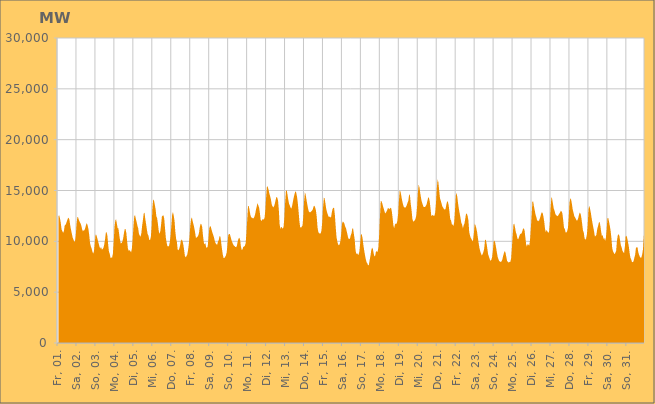
| Category | Series 0 |
|---|---|
|  Fr, 01.  | 12470.045 |
|  Fr, 01.  | 12579.284 |
|  Fr, 01.  | 12264.024 |
|  Fr, 01.  | 11831.025 |
|  Fr, 01.  | 11190.778 |
|  Fr, 01.  | 10995.93 |
|  Fr, 01.  | 10841.013 |
|  Fr, 01.  | 11021.117 |
|  Fr, 01.  | 11565.128 |
|  Fr, 01.  | 11624.901 |
|  Fr, 01.  | 11789.44 |
|  Fr, 01.  | 12039.204 |
|  Fr, 01.  | 12247.972 |
|  Fr, 01.  | 12329.81 |
|  Fr, 01.  | 12092.422 |
|  Fr, 01.  | 11547.91 |
|  Fr, 01.  | 11128.463 |
|  Sa, 02.  | 10759.874 |
|  Sa, 02.  | 10378.905 |
|  Sa, 02.  | 10196.635 |
|  Sa, 02.  | 9977.144 |
|  Sa, 02.  | 9987.617 |
|  Sa, 02.  | 10588.651 |
|  Sa, 02.  | 11725.365 |
|  Sa, 02.  | 12389.724 |
|  Sa, 02.  | 12343.848 |
|  Sa, 02.  | 12091.464 |
|  Sa, 02.  | 11911.762 |
|  Sa, 02.  | 11768.814 |
|  Sa, 02.  | 11549.215 |
|  Sa, 02.  | 11196.974 |
|  Sa, 02.  | 10992.181 |
|  Sa, 02.  | 11084.473 |
|  Sa, 02.  | 11095.089 |
|  Sa, 02.  | 11310.61 |
|  Sa, 02.  | 11616.985 |
|  Sa, 02.  | 11796.725 |
|  Sa, 02.  | 11566.871 |
|  Sa, 02.  | 11211.464 |
|  Sa, 02.  | 10649.488 |
|  Sa, 02.  | 9843.555 |
|  So, 03.  | 9511.741 |
|  So, 03.  | 9309.536 |
|  So, 03.  | 9007.532 |
|  So, 03.  | 8792.565 |
|  So, 03.  | 9015.24 |
|  So, 03.  | 9802.419 |
|  So, 03.  | 10660.798 |
|  So, 03.  | 10641.216 |
|  So, 03.  | 10369.956 |
|  So, 03.  | 10086.164 |
|  So, 03.  | 9777.794 |
|  So, 03.  | 9479.992 |
|  So, 03.  | 9280.482 |
|  So, 03.  | 9453.215 |
|  So, 03.  | 9188.988 |
|  So, 03.  | 9235.819 |
|  So, 03.  | 9350.889 |
|  So, 03.  | 9688.885 |
|  So, 03.  | 10147.957 |
|  So, 03.  | 10824.316 |
|  So, 03.  | 10922.26 |
|  So, 03.  | 10545.41 |
|  So, 03.  | 9702.404 |
|  So, 03.  | 8962.431 |
|  Mo, 04.  | 8784.504 |
|  Mo, 04.  | 8354.536 |
|  Mo, 04.  | 8411.387 |
|  Mo, 04.  | 8404.765 |
|  Mo, 04.  | 8795.974 |
|  Mo, 04.  | 9951.689 |
|  Mo, 04.  | 11378.006 |
|  Mo, 04.  | 12028.84 |
|  Mo, 04.  | 12188.491 |
|  Mo, 04.  | 11734.409 |
|  Mo, 04.  | 11306.727 |
|  Mo, 04.  | 11262.249 |
|  Mo, 04.  | 10655.644 |
|  Mo, 04.  | 10128.674 |
|  Mo, 04.  | 9785.554 |
|  Mo, 04.  | 9840.763 |
|  Mo, 04.  | 9981.282 |
|  Mo, 04.  | 10306.964 |
|  Mo, 04.  | 10799.12 |
|  Mo, 04.  | 11201.983 |
|  Mo, 04.  | 11211.534 |
|  Mo, 04.  | 10828.387 |
|  Mo, 04.  | 10006.678 |
|  Mo, 04.  | 9292.177 |
|  Di, 05.  | 9070.221 |
|  Di, 05.  | 9130.839 |
|  Di, 05.  | 9047.178 |
|  Di, 05.  | 8911.95 |
|  Di, 05.  | 9291.472 |
|  Di, 05.  | 10222.007 |
|  Di, 05.  | 11434.899 |
|  Di, 05.  | 12460.883 |
|  Di, 05.  | 12587.895 |
|  Di, 05.  | 12233.071 |
|  Di, 05.  | 11904.814 |
|  Di, 05.  | 11548.537 |
|  Di, 05.  | 11281.24 |
|  Di, 05.  | 10732.146 |
|  Di, 05.  | 10568.035 |
|  Di, 05.  | 10446.677 |
|  Di, 05.  | 10801.356 |
|  Di, 05.  | 11536.17 |
|  Di, 05.  | 12098.566 |
|  Di, 05.  | 12746.347 |
|  Di, 05.  | 12825.971 |
|  Di, 05.  | 12196.645 |
|  Di, 05.  | 11708.184 |
|  Di, 05.  | 11167.269 |
|  Mi, 06.  | 10699.596 |
|  Mi, 06.  | 10561.771 |
|  Mi, 06.  | 10154.91 |
|  Mi, 06.  | 10125.99 |
|  Mi, 06.  | 10414.044 |
|  Mi, 06.  | 11431.736 |
|  Mi, 06.  | 13247.887 |
|  Mi, 06.  | 14133.794 |
|  Mi, 06.  | 14007.125 |
|  Mi, 06.  | 13610.049 |
|  Mi, 06.  | 13174.088 |
|  Mi, 06.  | 12470.583 |
|  Mi, 06.  | 12272.704 |
|  Mi, 06.  | 11710.298 |
|  Mi, 06.  | 11014.485 |
|  Mi, 06.  | 10741.12 |
|  Mi, 06.  | 10993.189 |
|  Mi, 06.  | 11648.631 |
|  Mi, 06.  | 12424.979 |
|  Mi, 06.  | 12535.889 |
|  Mi, 06.  | 12563.196 |
|  Mi, 06.  | 12207.325 |
|  Mi, 06.  | 11255.182 |
|  Mi, 06.  | 10356.174 |
|  Do, 07.  | 9881.779 |
|  Do, 07.  | 9523.425 |
|  Do, 07.  | 9509.322 |
|  Do, 07.  | 9523.329 |
|  Do, 07.  | 9923.382 |
|  Do, 07.  | 10567.877 |
|  Do, 07.  | 11567.861 |
|  Do, 07.  | 12609.888 |
|  Do, 07.  | 12896.24 |
|  Do, 07.  | 12519.616 |
|  Do, 07.  | 12027.759 |
|  Do, 07.  | 10958.798 |
|  Do, 07.  | 10260.236 |
|  Do, 07.  | 9932.591 |
|  Do, 07.  | 9171.962 |
|  Do, 07.  | 9127.922 |
|  Do, 07.  | 9290.294 |
|  Do, 07.  | 9569.246 |
|  Do, 07.  | 10043.785 |
|  Do, 07.  | 10183.195 |
|  Do, 07.  | 10058.85 |
|  Do, 07.  | 9733.159 |
|  Do, 07.  | 9230.453 |
|  Do, 07.  | 8606.601 |
|  Fr, 08.  | 8425.27 |
|  Fr, 08.  | 8523.573 |
|  Fr, 08.  | 8673.962 |
|  Fr, 08.  | 9065.229 |
|  Fr, 08.  | 9663.098 |
|  Fr, 08.  | 10471.212 |
|  Fr, 08.  | 11567.649 |
|  Fr, 08.  | 12182.165 |
|  Fr, 08.  | 12345.604 |
|  Fr, 08.  | 11970.049 |
|  Fr, 08.  | 11672.742 |
|  Fr, 08.  | 11320.872 |
|  Fr, 08.  | 10881.437 |
|  Fr, 08.  | 10373.778 |
|  Fr, 08.  | 10360.007 |
|  Fr, 08.  | 10451.458 |
|  Fr, 08.  | 10559.697 |
|  Fr, 08.  | 10849.24 |
|  Fr, 08.  | 11417.743 |
|  Fr, 08.  | 11727.408 |
|  Fr, 08.  | 11680.441 |
|  Fr, 08.  | 11410.719 |
|  Fr, 08.  | 10585.961 |
|  Fr, 08.  | 9919.559 |
|  Sa, 09.  | 9692.706 |
|  Sa, 09.  | 9822.974 |
|  Sa, 09.  | 9436.05 |
|  Sa, 09.  | 9348.416 |
|  Sa, 09.  | 9495.277 |
|  Sa, 09.  | 10314.714 |
|  Sa, 09.  | 11291.765 |
|  Sa, 09.  | 11523.163 |
|  Sa, 09.  | 11402.611 |
|  Sa, 09.  | 11104.646 |
|  Sa, 09.  | 10837.048 |
|  Sa, 09.  | 10622.243 |
|  Sa, 09.  | 10363.615 |
|  Sa, 09.  | 10023.064 |
|  Sa, 09.  | 9806.507 |
|  Sa, 09.  | 9710.982 |
|  Sa, 09.  | 9671.656 |
|  Sa, 09.  | 9986.29 |
|  Sa, 09.  | 10133.873 |
|  Sa, 09.  | 10527.428 |
|  Sa, 09.  | 10469.307 |
|  Sa, 09.  | 9906.316 |
|  Sa, 09.  | 9286.69 |
|  Sa, 09.  | 8736.228 |
|  So, 10.  | 8373.814 |
|  So, 10.  | 8359.905 |
|  So, 10.  | 8464.729 |
|  So, 10.  | 8605.559 |
|  So, 10.  | 8901.723 |
|  So, 10.  | 9638.665 |
|  So, 10.  | 10611.814 |
|  So, 10.  | 10732.565 |
|  So, 10.  | 10718.493 |
|  So, 10.  | 10432.608 |
|  So, 10.  | 10147.333 |
|  So, 10.  | 9913.026 |
|  So, 10.  | 9739.812 |
|  So, 10.  | 9588.663 |
|  So, 10.  | 9536.704 |
|  So, 10.  | 9436.427 |
|  So, 10.  | 9428.472 |
|  So, 10.  | 9589.456 |
|  So, 10.  | 9993.66 |
|  So, 10.  | 10272.355 |
|  So, 10.  | 10358.533 |
|  So, 10.  | 10159.177 |
|  So, 10.  | 9494.374 |
|  So, 10.  | 9153.733 |
|  Mo, 11.  | 9188.825 |
|  Mo, 11.  | 9456.394 |
|  Mo, 11.  | 9475.973 |
|  Mo, 11.  | 9549.127 |
|  Mo, 11.  | 9821.698 |
|  Mo, 11.  | 10779.585 |
|  Mo, 11.  | 12080.499 |
|  Mo, 11.  | 13455.255 |
|  Mo, 11.  | 13482.77 |
|  Mo, 11.  | 13025.238 |
|  Mo, 11.  | 12593.2 |
|  Mo, 11.  | 12357.89 |
|  Mo, 11.  | 12332.527 |
|  Mo, 11.  | 12263.578 |
|  Mo, 11.  | 12263.409 |
|  Mo, 11.  | 12392.698 |
|  Mo, 11.  | 12659.495 |
|  Mo, 11.  | 13071.538 |
|  Mo, 11.  | 13415.481 |
|  Mo, 11.  | 13770.832 |
|  Mo, 11.  | 13539.051 |
|  Mo, 11.  | 13340.712 |
|  Mo, 11.  | 12807.211 |
|  Mo, 11.  | 12132.086 |
|  Di, 12.  | 11999.17 |
|  Di, 12.  | 12152.092 |
|  Di, 12.  | 12178.994 |
|  Di, 12.  | 12140.769 |
|  Di, 12.  | 12332.086 |
|  Di, 12.  | 13117.255 |
|  Di, 12.  | 14405.647 |
|  Di, 12.  | 15440.513 |
|  Di, 12.  | 15358.984 |
|  Di, 12.  | 15091.4 |
|  Di, 12.  | 14714.685 |
|  Di, 12.  | 14432.677 |
|  Di, 12.  | 14133.221 |
|  Di, 12.  | 13643.782 |
|  Di, 12.  | 13444.063 |
|  Di, 12.  | 13340.153 |
|  Di, 12.  | 13459.05 |
|  Di, 12.  | 13722.418 |
|  Di, 12.  | 14071.435 |
|  Di, 12.  | 14375.322 |
|  Di, 12.  | 14305.829 |
|  Di, 12.  | 14026.325 |
|  Di, 12.  | 13124.068 |
|  Di, 12.  | 11695.294 |
|  Mi, 13.  | 11207.292 |
|  Mi, 13.  | 11436.828 |
|  Mi, 13.  | 11341.08 |
|  Mi, 13.  | 11232.356 |
|  Mi, 13.  | 11415.734 |
|  Mi, 13.  | 12284.977 |
|  Mi, 13.  | 13801.102 |
|  Mi, 13.  | 14945.613 |
|  Mi, 13.  | 15035.051 |
|  Mi, 13.  | 14592.859 |
|  Mi, 13.  | 14072.063 |
|  Mi, 13.  | 13690.605 |
|  Mi, 13.  | 13505.175 |
|  Mi, 13.  | 13291.454 |
|  Mi, 13.  | 13222.578 |
|  Mi, 13.  | 13542.256 |
|  Mi, 13.  | 13985.048 |
|  Mi, 13.  | 14360.848 |
|  Mi, 13.  | 14683.293 |
|  Mi, 13.  | 14931.568 |
|  Mi, 13.  | 14788.487 |
|  Mi, 13.  | 14419.473 |
|  Mi, 13.  | 13802.077 |
|  Mi, 13.  | 12957.466 |
|  Do, 14.  | 12019.518 |
|  Do, 14.  | 11398.368 |
|  Do, 14.  | 11345.433 |
|  Do, 14.  | 11437.23 |
|  Do, 14.  | 11559.348 |
|  Do, 14.  | 12463.496 |
|  Do, 14.  | 13923.431 |
|  Do, 14.  | 14813.142 |
|  Do, 14.  | 14585.404 |
|  Do, 14.  | 14120.61 |
|  Do, 14.  | 13653.94 |
|  Do, 14.  | 13230.466 |
|  Do, 14.  | 12932.462 |
|  Do, 14.  | 12867.554 |
|  Do, 14.  | 12867.138 |
|  Do, 14.  | 12933.639 |
|  Do, 14.  | 13024.907 |
|  Do, 14.  | 13142.434 |
|  Do, 14.  | 13434.499 |
|  Do, 14.  | 13500.351 |
|  Do, 14.  | 13332.348 |
|  Do, 14.  | 13024.942 |
|  Do, 14.  | 12411.388 |
|  Do, 14.  | 11355.239 |
|  Fr, 15.  | 10934.244 |
|  Fr, 15.  | 10774.744 |
|  Fr, 15.  | 10788.732 |
|  Fr, 15.  | 10772.951 |
|  Fr, 15.  | 11084.754 |
|  Fr, 15.  | 11924.153 |
|  Fr, 15.  | 13340.119 |
|  Fr, 15.  | 14282.343 |
|  Fr, 15.  | 14227.926 |
|  Fr, 15.  | 13730.312 |
|  Fr, 15.  | 13184.681 |
|  Fr, 15.  | 12876.907 |
|  Fr, 15.  | 12646.066 |
|  Fr, 15.  | 12422.493 |
|  Fr, 15.  | 12407.947 |
|  Fr, 15.  | 12429.884 |
|  Fr, 15.  | 12313.456 |
|  Fr, 15.  | 12803.142 |
|  Fr, 15.  | 13176.054 |
|  Fr, 15.  | 13316.482 |
|  Fr, 15.  | 13269.851 |
|  Fr, 15.  | 12553.725 |
|  Fr, 15.  | 11425.176 |
|  Fr, 15.  | 10431.643 |
|  Sa, 16.  | 9996.127 |
|  Sa, 16.  | 9711.235 |
|  Sa, 16.  | 9601.175 |
|  Sa, 16.  | 9728.612 |
|  Sa, 16.  | 10045.436 |
|  Sa, 16.  | 10759.018 |
|  Sa, 16.  | 11710.286 |
|  Sa, 16.  | 11945.569 |
|  Sa, 16.  | 11872.616 |
|  Sa, 16.  | 11740.283 |
|  Sa, 16.  | 11455.728 |
|  Sa, 16.  | 11302.512 |
|  Sa, 16.  | 10967.044 |
|  Sa, 16.  | 10624.759 |
|  Sa, 16.  | 10276.561 |
|  Sa, 16.  | 10259.944 |
|  Sa, 16.  | 10239.951 |
|  Sa, 16.  | 10590.081 |
|  Sa, 16.  | 10775.194 |
|  Sa, 16.  | 11249.677 |
|  Sa, 16.  | 11276.132 |
|  Sa, 16.  | 10721.697 |
|  Sa, 16.  | 10209.417 |
|  Sa, 16.  | 9189.638 |
|  So, 17.  | 8747.816 |
|  So, 17.  | 8847.835 |
|  So, 17.  | 8716.929 |
|  So, 17.  | 8681.62 |
|  So, 17.  | 9008.572 |
|  So, 17.  | 9806.432 |
|  So, 17.  | 10721.604 |
|  So, 17.  | 10665.078 |
|  So, 17.  | 10324.74 |
|  So, 17.  | 9655.381 |
|  So, 17.  | 9148.337 |
|  So, 17.  | 8674.712 |
|  So, 17.  | 8266.955 |
|  So, 17.  | 7951.864 |
|  So, 17.  | 7838.754 |
|  So, 17.  | 7633.868 |
|  So, 17.  | 7690.695 |
|  So, 17.  | 8161.176 |
|  So, 17.  | 8576.22 |
|  So, 17.  | 9109.481 |
|  So, 17.  | 9369.429 |
|  So, 17.  | 9276.975 |
|  So, 17.  | 8835.402 |
|  So, 17.  | 8521.634 |
|  Mo, 18.  | 8580.722 |
|  Mo, 18.  | 9007.628 |
|  Mo, 18.  | 9019.429 |
|  Mo, 18.  | 8947.289 |
|  Mo, 18.  | 9391.758 |
|  Mo, 18.  | 10643.276 |
|  Mo, 18.  | 12381.191 |
|  Mo, 18.  | 13972.287 |
|  Mo, 18.  | 13944.681 |
|  Mo, 18.  | 13713.035 |
|  Mo, 18.  | 13404.279 |
|  Mo, 18.  | 13172.322 |
|  Mo, 18.  | 12881.142 |
|  Mo, 18.  | 12737.626 |
|  Mo, 18.  | 12882.915 |
|  Mo, 18.  | 13042.834 |
|  Mo, 18.  | 13249.617 |
|  Mo, 18.  | 13264.128 |
|  Mo, 18.  | 13155.265 |
|  Mo, 18.  | 13267.503 |
|  Mo, 18.  | 13304.441 |
|  Mo, 18.  | 12971.49 |
|  Mo, 18.  | 12322.563 |
|  Mo, 18.  | 11579.113 |
|  Di, 19.  | 11289.348 |
|  Di, 19.  | 11675.015 |
|  Di, 19.  | 11746.467 |
|  Di, 19.  | 11726.46 |
|  Di, 19.  | 11980.071 |
|  Di, 19.  | 12658.078 |
|  Di, 19.  | 13951.892 |
|  Di, 19.  | 15002.134 |
|  Di, 19.  | 14887.831 |
|  Di, 19.  | 14500.069 |
|  Di, 19.  | 14046.886 |
|  Di, 19.  | 13692.885 |
|  Di, 19.  | 13423.756 |
|  Di, 19.  | 13332.915 |
|  Di, 19.  | 13312.617 |
|  Di, 19.  | 13392.341 |
|  Di, 19.  | 13564.575 |
|  Di, 19.  | 13804.106 |
|  Di, 19.  | 14012.257 |
|  Di, 19.  | 14628.012 |
|  Di, 19.  | 14503.439 |
|  Di, 19.  | 13679.869 |
|  Di, 19.  | 13085.668 |
|  Di, 19.  | 12245.065 |
|  Mi, 20.  | 11947.791 |
|  Mi, 20.  | 11980.553 |
|  Mi, 20.  | 12063.041 |
|  Mi, 20.  | 12204.061 |
|  Mi, 20.  | 12531.849 |
|  Mi, 20.  | 13383.629 |
|  Mi, 20.  | 14737.988 |
|  Mi, 20.  | 15576.006 |
|  Mi, 20.  | 15329.819 |
|  Mi, 20.  | 14757.91 |
|  Mi, 20.  | 14267.991 |
|  Mi, 20.  | 13881.663 |
|  Mi, 20.  | 13665.061 |
|  Mi, 20.  | 13402.981 |
|  Mi, 20.  | 13380.82 |
|  Mi, 20.  | 13386.877 |
|  Mi, 20.  | 13472.282 |
|  Mi, 20.  | 13620.005 |
|  Mi, 20.  | 13947.836 |
|  Mi, 20.  | 14309.026 |
|  Mi, 20.  | 14290.286 |
|  Mi, 20.  | 13931.919 |
|  Mi, 20.  | 13242.274 |
|  Mi, 20.  | 12477.243 |
|  Do, 21.  | 12562.326 |
|  Do, 21.  | 12583.806 |
|  Do, 21.  | 12500.054 |
|  Do, 21.  | 12526.376 |
|  Do, 21.  | 12855.784 |
|  Do, 21.  | 13823.212 |
|  Do, 21.  | 15247.845 |
|  Do, 21.  | 16089.319 |
|  Do, 21.  | 15802.649 |
|  Do, 21.  | 15009.899 |
|  Do, 21.  | 14225.494 |
|  Do, 21.  | 13994.284 |
|  Do, 21.  | 13709.264 |
|  Do, 21.  | 13429.23 |
|  Do, 21.  | 13323.666 |
|  Do, 21.  | 13170.79 |
|  Do, 21.  | 13131.812 |
|  Do, 21.  | 13169.437 |
|  Do, 21.  | 13585.806 |
|  Do, 21.  | 13904.081 |
|  Do, 21.  | 13912.046 |
|  Do, 21.  | 13535.916 |
|  Do, 21.  | 12889.509 |
|  Do, 21.  | 12170.582 |
|  Fr, 22.  | 12065.997 |
|  Fr, 22.  | 11689.339 |
|  Fr, 22.  | 11639.374 |
|  Fr, 22.  | 11512.496 |
|  Fr, 22.  | 11901.143 |
|  Fr, 22.  | 13024.842 |
|  Fr, 22.  | 14498.374 |
|  Fr, 22.  | 14762.507 |
|  Fr, 22.  | 14332.734 |
|  Fr, 22.  | 13668.519 |
|  Fr, 22.  | 13148.327 |
|  Fr, 22.  | 12717.443 |
|  Fr, 22.  | 12296.12 |
|  Fr, 22.  | 11807.388 |
|  Fr, 22.  | 11652.493 |
|  Fr, 22.  | 11268.411 |
|  Fr, 22.  | 11576.911 |
|  Fr, 22.  | 11761.757 |
|  Fr, 22.  | 12231.485 |
|  Fr, 22.  | 12728.649 |
|  Fr, 22.  | 12708.816 |
|  Fr, 22.  | 12490.714 |
|  Fr, 22.  | 12040.644 |
|  Fr, 22.  | 10925.279 |
|  Sa, 23.  | 10560.686 |
|  Sa, 23.  | 10327.193 |
|  Sa, 23.  | 10219.969 |
|  Sa, 23.  | 9998.118 |
|  Sa, 23.  | 10158.687 |
|  Sa, 23.  | 10870.999 |
|  Sa, 23.  | 11764.726 |
|  Sa, 23.  | 11562.869 |
|  Sa, 23.  | 11277.767 |
|  Sa, 23.  | 10893.667 |
|  Sa, 23.  | 10333.789 |
|  Sa, 23.  | 9797.073 |
|  Sa, 23.  | 9314.035 |
|  Sa, 23.  | 9004.923 |
|  Sa, 23.  | 8786.995 |
|  Sa, 23.  | 8606.932 |
|  Sa, 23.  | 8762.948 |
|  Sa, 23.  | 8962.468 |
|  Sa, 23.  | 9306.315 |
|  Sa, 23.  | 10123.309 |
|  Sa, 23.  | 10168.579 |
|  Sa, 23.  | 9768.69 |
|  Sa, 23.  | 9235.21 |
|  Sa, 23.  | 8706.677 |
|  So, 24.  | 8496.221 |
|  So, 24.  | 8235.046 |
|  So, 24.  | 8087.497 |
|  So, 24.  | 8178.622 |
|  So, 24.  | 8453.86 |
|  So, 24.  | 9132.142 |
|  So, 24.  | 10036.736 |
|  So, 24.  | 10067.716 |
|  So, 24.  | 9839.184 |
|  So, 24.  | 9390.579 |
|  So, 24.  | 8915.751 |
|  So, 24.  | 8469.219 |
|  So, 24.  | 8235.716 |
|  So, 24.  | 8052.421 |
|  So, 24.  | 8014.097 |
|  So, 24.  | 7952.417 |
|  So, 24.  | 8048.501 |
|  So, 24.  | 8239.871 |
|  So, 24.  | 8597.503 |
|  So, 24.  | 8851.246 |
|  So, 24.  | 9063.671 |
|  So, 24.  | 8861.466 |
|  So, 24.  | 8441.2 |
|  So, 24.  | 8068.216 |
|  Mo, 25.  | 7992.884 |
|  Mo, 25.  | 7900.979 |
|  Mo, 25.  | 7986.744 |
|  Mo, 25.  | 7970.377 |
|  Mo, 25.  | 8293.78 |
|  Mo, 25.  | 9339.7 |
|  Mo, 25.  | 10563.93 |
|  Mo, 25.  | 11659.169 |
|  Mo, 25.  | 11731.297 |
|  Mo, 25.  | 11373.499 |
|  Mo, 25.  | 10907.196 |
|  Mo, 25.  | 10677.121 |
|  Mo, 25.  | 10278.271 |
|  Mo, 25.  | 10209.135 |
|  Mo, 25.  | 10399.256 |
|  Mo, 25.  | 10644.06 |
|  Mo, 25.  | 10745.908 |
|  Mo, 25.  | 10755.951 |
|  Mo, 25.  | 10941.394 |
|  Mo, 25.  | 11198.089 |
|  Mo, 25.  | 11294.448 |
|  Mo, 25.  | 11097.6 |
|  Mo, 25.  | 10430.067 |
|  Mo, 25.  | 9729.321 |
|  Di, 26.  | 9494.16 |
|  Di, 26.  | 9714.938 |
|  Di, 26.  | 9676.062 |
|  Di, 26.  | 9576.204 |
|  Di, 26.  | 10153.636 |
|  Di, 26.  | 11296.982 |
|  Di, 26.  | 12549.232 |
|  Di, 26.  | 13926.28 |
|  Di, 26.  | 13903.92 |
|  Di, 26.  | 13406.034 |
|  Di, 26.  | 13015.307 |
|  Di, 26.  | 12621.994 |
|  Di, 26.  | 12374.174 |
|  Di, 26.  | 12021.334 |
|  Di, 26.  | 12072.853 |
|  Di, 26.  | 11962.758 |
|  Di, 26.  | 12157.571 |
|  Di, 26.  | 12400.038 |
|  Di, 26.  | 12716.419 |
|  Di, 26.  | 12870.51 |
|  Di, 26.  | 12777.222 |
|  Di, 26.  | 12416.805 |
|  Di, 26.  | 11893.183 |
|  Di, 26.  | 11213.629 |
|  Mi, 27.  | 10920.437 |
|  Mi, 27.  | 11122.364 |
|  Mi, 27.  | 10965.982 |
|  Mi, 27.  | 10856.298 |
|  Mi, 27.  | 10886.877 |
|  Mi, 27.  | 11720.436 |
|  Mi, 27.  | 13275.625 |
|  Mi, 27.  | 14329.496 |
|  Mi, 27.  | 14175.816 |
|  Mi, 27.  | 13686.464 |
|  Mi, 27.  | 13222.903 |
|  Mi, 27.  | 13010.33 |
|  Mi, 27.  | 12702.969 |
|  Mi, 27.  | 12558.81 |
|  Mi, 27.  | 12540.643 |
|  Mi, 27.  | 12469.826 |
|  Mi, 27.  | 12595.857 |
|  Mi, 27.  | 12716.884 |
|  Mi, 27.  | 12853.949 |
|  Mi, 27.  | 13013.096 |
|  Mi, 27.  | 12937.779 |
|  Mi, 27.  | 12718.75 |
|  Mi, 27.  | 12054.443 |
|  Mi, 27.  | 11325.62 |
|  Do, 28.  | 11226.478 |
|  Do, 28.  | 10883.033 |
|  Do, 28.  | 10869.103 |
|  Do, 28.  | 11002.974 |
|  Do, 28.  | 11312.979 |
|  Do, 28.  | 12431.276 |
|  Do, 28.  | 13824.998 |
|  Do, 28.  | 14251.338 |
|  Do, 28.  | 14089.591 |
|  Do, 28.  | 13662.638 |
|  Do, 28.  | 13134.445 |
|  Do, 28.  | 12816.57 |
|  Do, 28.  | 12479.283 |
|  Do, 28.  | 12350.342 |
|  Do, 28.  | 12195.501 |
|  Do, 28.  | 12048.08 |
|  Do, 28.  | 12069.747 |
|  Do, 28.  | 12295.45 |
|  Do, 28.  | 12628.462 |
|  Do, 28.  | 12851.476 |
|  Do, 28.  | 12700.276 |
|  Do, 28.  | 12294.706 |
|  Do, 28.  | 11695.12 |
|  Do, 28.  | 11060.068 |
|  Fr, 29.  | 10862.555 |
|  Fr, 29.  | 10301 |
|  Fr, 29.  | 10159.256 |
|  Fr, 29.  | 10291.085 |
|  Fr, 29.  | 10701.538 |
|  Fr, 29.  | 11600.598 |
|  Fr, 29.  | 13162.645 |
|  Fr, 29.  | 13515.058 |
|  Fr, 29.  | 13175.546 |
|  Fr, 29.  | 12782.316 |
|  Fr, 29.  | 12257.588 |
|  Fr, 29.  | 11812.183 |
|  Fr, 29.  | 11395.685 |
|  Fr, 29.  | 10993.221 |
|  Fr, 29.  | 10486.518 |
|  Fr, 29.  | 10514.356 |
|  Fr, 29.  | 10663.738 |
|  Fr, 29.  | 11191.21 |
|  Fr, 29.  | 11482.612 |
|  Fr, 29.  | 11808.167 |
|  Fr, 29.  | 11932 |
|  Fr, 29.  | 11527.326 |
|  Fr, 29.  | 10937.34 |
|  Fr, 29.  | 10510.379 |
|  Sa, 30.  | 10632.734 |
|  Sa, 30.  | 10228.863 |
|  Sa, 30.  | 10325.744 |
|  Sa, 30.  | 10041.274 |
|  Sa, 30.  | 10351.868 |
|  Sa, 30.  | 11182.819 |
|  Sa, 30.  | 12294.812 |
|  Sa, 30.  | 12298.27 |
|  Sa, 30.  | 11928.835 |
|  Sa, 30.  | 11498.834 |
|  Sa, 30.  | 11021.951 |
|  Sa, 30.  | 10310.173 |
|  Sa, 30.  | 9347.77 |
|  Sa, 30.  | 9018.072 |
|  Sa, 30.  | 8864.678 |
|  Sa, 30.  | 8739.854 |
|  Sa, 30.  | 8871.053 |
|  Sa, 30.  | 9088.725 |
|  Sa, 30.  | 10052.711 |
|  Sa, 30.  | 10587.122 |
|  Sa, 30.  | 10703.146 |
|  Sa, 30.  | 10556.88 |
|  Sa, 30.  | 10058.78 |
|  Sa, 30.  | 9606.728 |
|  So, 31.  | 9385.941 |
|  So, 31.  | 9059.092 |
|  So, 31.  | 8940.185 |
|  So, 31.  | 8831.248 |
|  So, 31.  | 9471.066 |
|  So, 31.  | 10472.589 |
|  So, 31.  | 10558.647 |
|  So, 31.  | 10316.842 |
|  So, 31.  | 9912.786 |
|  So, 31.  | 9514.795 |
|  So, 31.  | 8868.257 |
|  So, 31.  | 8409.555 |
|  So, 31.  | 8224.487 |
|  So, 31.  | 7971.237 |
|  So, 31.  | 7941.391 |
|  So, 31.  | 8041.747 |
|  So, 31.  | 8381.903 |
|  So, 31.  | 8668.859 |
|  So, 31.  | 9338.07 |
|  So, 31.  | 9423.276 |
|  So, 31.  | 9419.819 |
|  So, 31.  | 8937.427 |
|  So, 31.  | 8657.654 |
|  Mo, 01.  | 8496.225 |
|  Mo, 01.  | 8375.766 |
|  Mo, 01.  | 8421.989 |
|  Mo, 01.  | 8741.956 |
|  Mo, 01.  | 9247.548 |
|  Mo, 01.  | 10483.136 |
|    | 11244.409 |